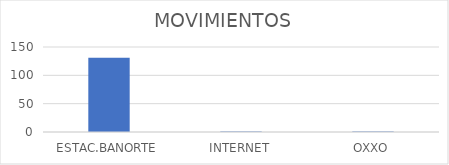
| Category | MOVIMIENTOS |
|---|---|
| ESTAC.BANORTE | 131 |
| INTERNET | 1 |
| OXXO | 1 |